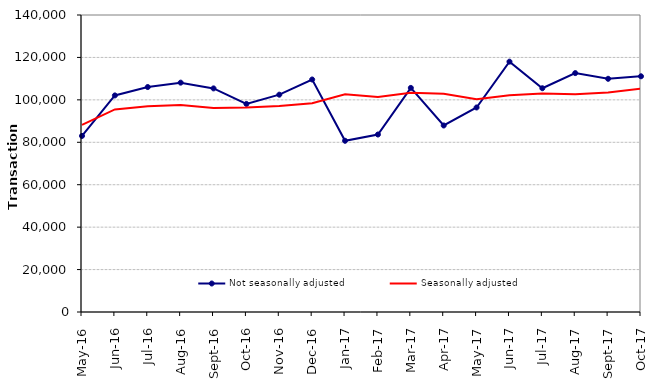
| Category | Not seasonally adjusted | Seasonally adjusted |
|---|---|---|
| 2016-05-01 | 83000 | 88210 |
| 2016-06-01 | 102090 | 95470 |
| 2016-07-01 | 106040 | 97000 |
| 2016-08-01 | 108110 | 97580 |
| 2016-09-01 | 105400 | 96220 |
| 2016-10-01 | 98070 | 96400 |
| 2016-11-01 | 102440 | 97110 |
| 2016-12-01 | 109600 | 98380 |
| 2017-01-01 | 80710 | 102660 |
| 2017-02-01 | 83670 | 101300 |
| 2017-03-01 | 105640 | 103360 |
| 2017-04-01 | 87920 | 102910 |
| 2017-05-01 | 96410 | 100260 |
| 2017-06-01 | 118010 | 102180 |
| 2017-07-01 | 105480 | 103050 |
| 2017-08-01 | 112610 | 102600 |
| 2017-09-01 | 109930 | 103460 |
| 2017-10-01 | 111110 | 105260 |